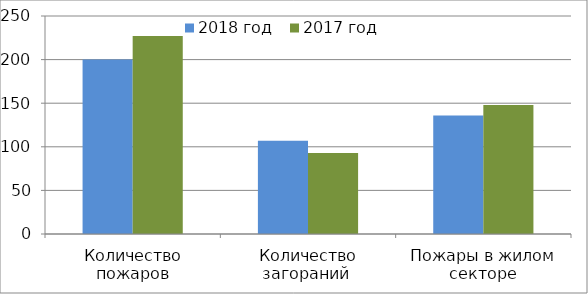
| Category | 2018 год | 2017 год |
|---|---|---|
| Количество пожаров | 200 | 227 |
| Количество загораний  | 107 | 93 |
| Пожары в жилом секторе | 136 | 148 |